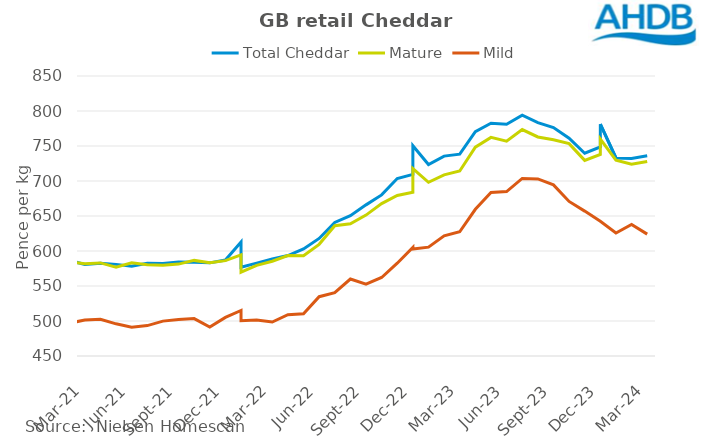
| Category | Total Cheddar | Mature | Mild |
|---|---|---|---|
| 2020-08-15 | 603.03 | 605.35 | 520.18 |
| 2020-09-12 | 599.76 | 600.44 | 511.57 |
| 2020-10-10 | 601.55 | 594.45 | 528.62 |
| 2020-11-07 | 587.55 | 588.02 | 517.7 |
| 2020-12-05 | 594.26 | 589.13 | 518.36 |
| 2021-01-02 | 607.5 | 591.11 | 519.64 |
| 2021-01-30 | 588.29 | 586.9 | 506.22 |
| 2021-02-27 | 586.69 | 584.84 | 496.88 |
| 2021-03-27 | 580.85 | 581.82 | 501.4 |
| 2021-04-24 | 582.61 | 583 | 502.47 |
| 2021-05-22 | 580.89 | 576.75 | 495.97 |
| 2021-06-19 | 578.14 | 583.08 | 491.18 |
| 2021-07-17 | 582.5 | 580.53 | 493.46 |
| 2021-08-14 | 582.17 | 579.65 | 499.81 |
| 2021-09-11 | 584.16 | 581.27 | 502.14 |
| 2021-10-09 | 583.88 | 586.58 | 503.43 |
| 2021-11-06 | 583.06 | 583.1 | 491.42 |
| 2021-12-04 | 587.15 | 586.23 | 505.1 |
| 2022-01-01 | 612.87 | 594.56 | 515.01 |
| 2022-01-29 | 576.76 | 569.69 | 500.53 |
| 2022-02-26 | 582.62 | 579.56 | 501.41 |
| 2022-03-26 | 588.52 | 585.32 | 498.52 |
| 2022-04-23 | 593.45 | 593.44 | 508.92 |
| 2022-05-21 | 602.94 | 593.14 | 510.27 |
| 2022-06-18 | 617.91 | 609.52 | 534.74 |
| 2022-07-16 | 640.86 | 636.07 | 540.42 |
| 2022-08-13 | 650.54 | 638.8 | 560 |
| 2022-09-10 | 665.91 | 651.31 | 552.74 |
| 2022-10-08 | 680.14 | 667.78 | 562.15 |
| 2022-11-05 | 703.58 | 679.28 | 582.56 |
| 2022-12-03 | 709.51 | 683.8 | 605.18 |
| 2022-12-31 | 750.38 | 717.85 | 602.84 |
| 2023-01-28 | 723.54 | 698.17 | 605.54 |
| 2023-02-25 | 735.54 | 708.73 | 621.69 |
| 2023-03-25 | 738.39 | 714.25 | 627.46 |
| 2023-04-22 | 770.54 | 748.34 | 659.61 |
| 2023-05-20 | 782.51 | 762.33 | 683.61 |
| 2023-06-17 | 780.99 | 756.89 | 684.94 |
| 2023-07-15 | 793.99 | 773.54 | 703.66 |
| 2023-08-12 | 783.35 | 762.89 | 702.91 |
| 2023-09-09 | 776.4 | 758.97 | 694.48 |
| 2023-10-07 | 761.11 | 753.41 | 670.79 |
| 2023-11-04 | 739.68 | 729.45 | 657 |
| 2023-12-02 | 748.74 | 738.03 | 642.43 |
| 2023-12-30 | 781.16 | 759.94 | 642.98 |
| 2024-01-27 | 732.97 | 729.88 | 625.77 |
| 2024-02-24 | 732.16 | 724.05 | 638.04 |
| 2024-03-23 | 736.08 | 727.98 | 624.12 |